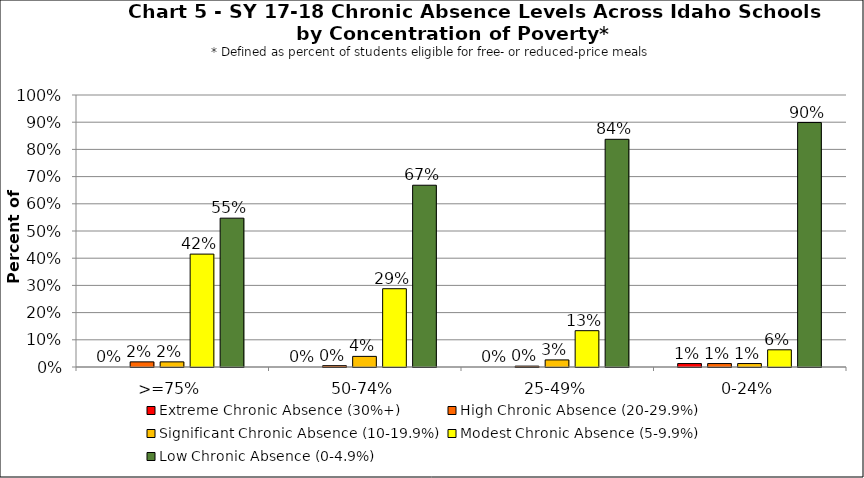
| Category | Extreme Chronic Absence (30%+) | High Chronic Absence (20-29.9%) | Significant Chronic Absence (10-19.9%) | Modest Chronic Absence (5-9.9%) | Low Chronic Absence (0-4.9%) |
|---|---|---|---|---|---|
| 0 | 0 | 0.019 | 0.019 | 0.415 | 0.547 |
| 1 | 0 | 0.005 | 0.039 | 0.288 | 0.668 |
| 2 | 0 | 0.003 | 0.026 | 0.134 | 0.837 |
| 3 | 0.013 | 0.013 | 0.013 | 0.063 | 0.899 |